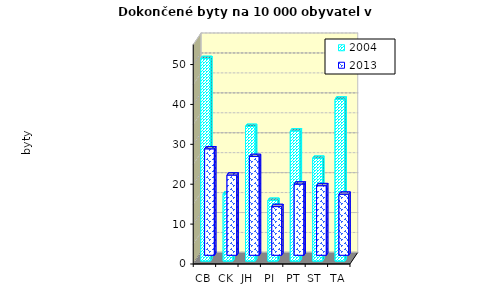
| Category | 2004 | 2013 |
|---|---|---|
| CB | 50.768 | 26.683 |
| CK | 16.846 | 20.097 |
| JH | 33.752 | 24.75 |
| PI | 15.225 | 12.206 |
| PT | 32.614 | 17.841 |
| ST | 25.773 | 17.435 |
| TA | 40.591 | 15.303 |